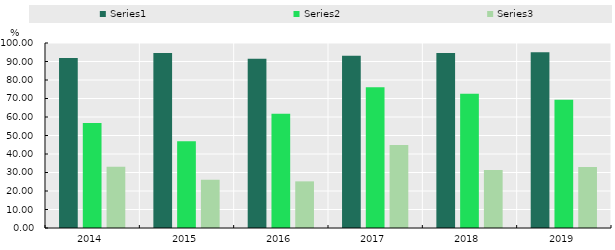
| Category | Series 0 | Series 1 | Series 2 |
|---|---|---|---|
| 2014.0 | 91.903 | 56.802 | 33.046 |
| 2015.0 | 94.644 | 46.898 | 26.086 |
| 2016.0 | 91.528 | 61.698 | 25.21 |
| 2017.0 | 93.064 | 76.046 | 44.903 |
| 2018.0 | 94.649 | 72.583 | 31.385 |
| 2019.0 | 95.03 | 69.298 | 33.026 |